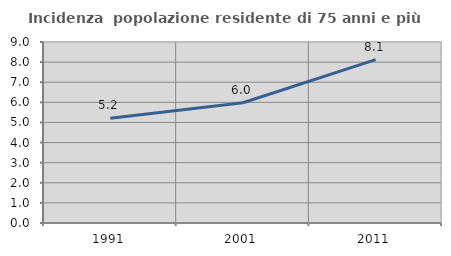
| Category | Incidenza  popolazione residente di 75 anni e più |
|---|---|
| 1991.0 | 5.206 |
| 2001.0 | 5.981 |
| 2011.0 | 8.124 |